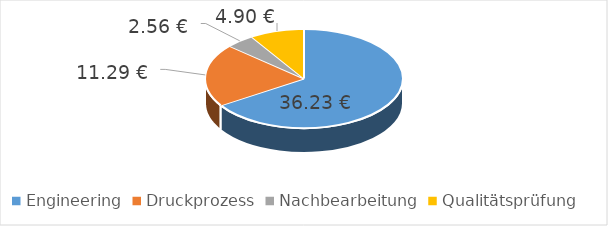
| Category | Series 0 |
|---|---|
| 0 | 36.23 |
| 1 | 11.294 |
| 2 | 2.555 |
| 3 | 4.9 |